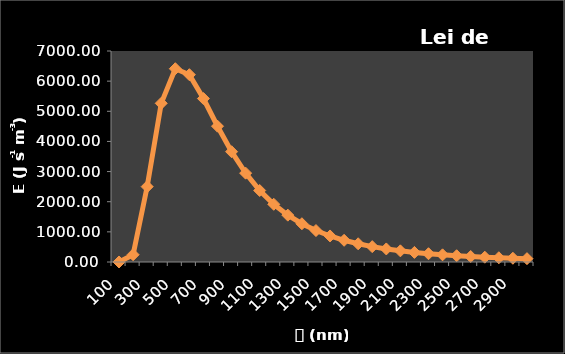
| Category | Series 0 |
|---|---|
| 100.0 | 0.016 |
| 200.0 | 241.666 |
| 300.0 | 2499.957 |
| 400.0 | 5264.346 |
| 500.0 | 6412.353 |
| 600.0 | 6214.13 |
| 700.0 | 5423.111 |
| 800.0 | 4504.832 |
| 900.0 | 3659.403 |
| 1000.0 | 2947.833 |
| 1100.0 | 2372.406 |
| 1200.0 | 1915.196 |
| 1300.0 | 1554.191 |
| 1400.0 | 1269.201 |
| 1500.0 | 1043.505 |
| 1600.0 | 863.866 |
| 1700.0 | 720.022 |
| 1800.0 | 604.092 |
| 1900.0 | 510.036 |
| 2000.0 | 433.221 |
| 2100.0 | 370.081 |
| 2200.0 | 317.854 |
| 2300.0 | 274.395 |
| 2400.0 | 238.022 |
| 2500.0 | 207.412 |
| 2600.0 | 181.518 |
| 2700.0 | 159.503 |
| 2800.0 | 140.698 |
| 2900.0 | 124.562 |
| 3000.0 | 110.658 |